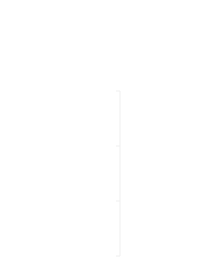
| Category | Positivo | NEGATIVO |
|---|---|---|
| 0 | 0 | 0 |
| 1 | 0 | 0 |
| 2 | 0 | 0 |